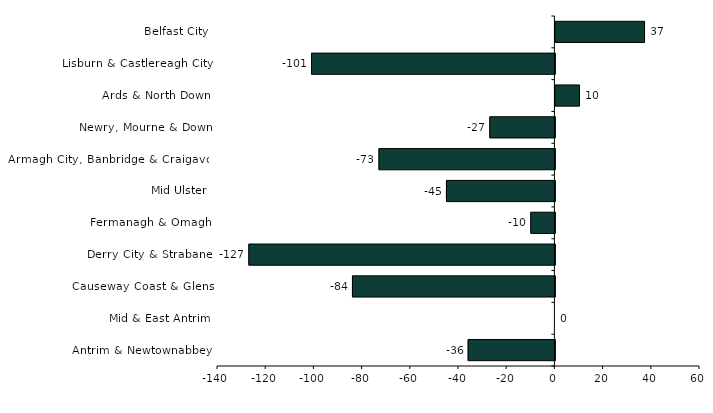
| Category | Series 0 |
|---|---|
| Belfast City | 37 |
| Lisburn & Castlereagh City | -101 |
| Ards & North Down | 10 |
| Newry, Mourne & Down | -27 |
| Armagh City, Banbridge & Craigavon | -73 |
| Mid Ulster | -45 |
| Fermanagh & Omagh | -10 |
| Derry City & Strabane | -127 |
| Causeway Coast & Glens | -84 |
| Mid & East Antrim | 0 |
| Antrim & Newtownabbey | -36 |